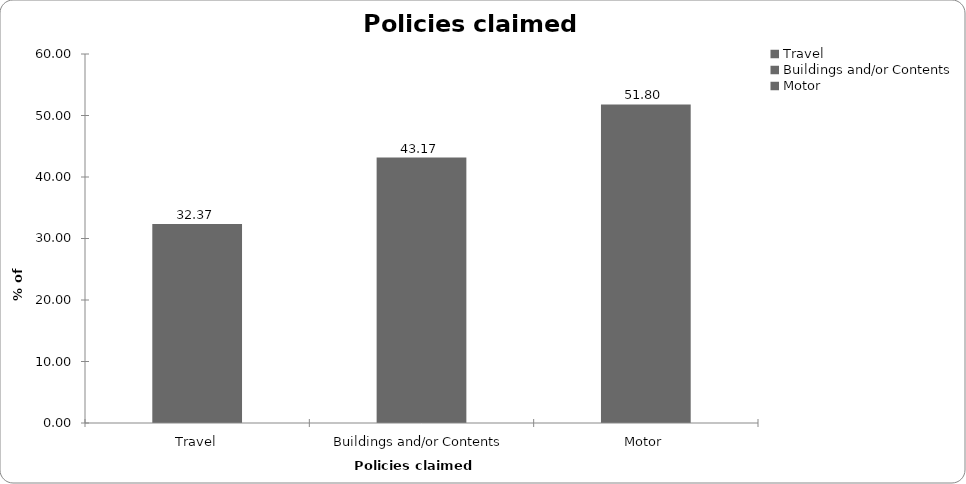
| Category | Policies claimed on |
|---|---|
| Travel | 32.374 |
| Buildings and/or Contents | 43.165 |
| Motor | 51.799 |